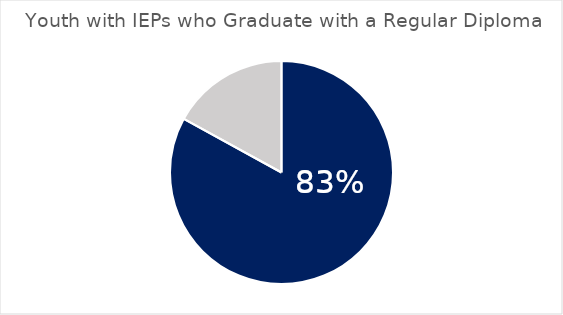
| Category | Series 0 |
|---|---|
| 0 | 0.83 |
| 1 | 0.17 |